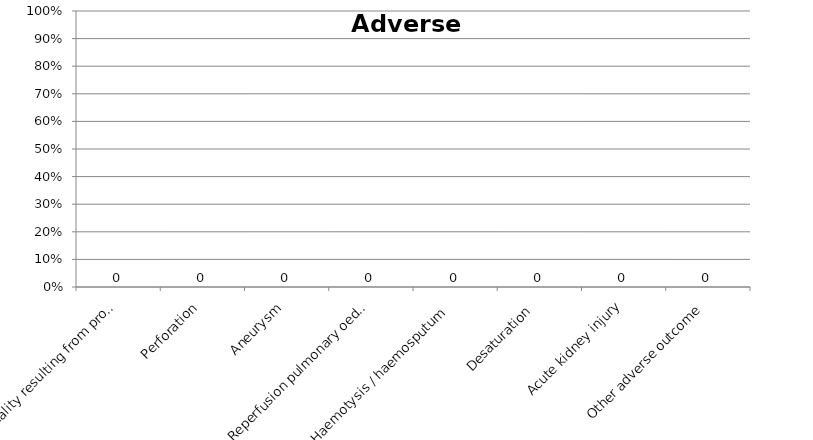
| Category | Series 0 |
|---|---|
| Mortality resulting from procedure | 0 |
| Perforation | 0 |
| Aneurysm | 0 |
| Reperfusion pulmonary oedema | 0 |
| Haemotysis / haemosputum  | 0 |
| Desaturation  | 0 |
| Acute kidney injury | 0 |
| Other adverse outcome | 0 |